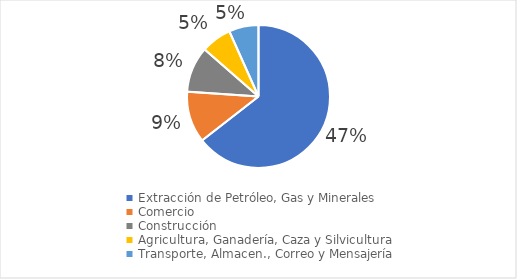
| Category | Series 0 |
|---|---|
| Extracción de Petróleo, Gas y Minerales | 0.474 |
| Comercio | 0.085 |
| Construcción | 0.076 |
| Agricultura, Ganadería, Caza y Silvicultura | 0.051 |
| Transporte, Almacen., Correo y Mensajería | 0.049 |